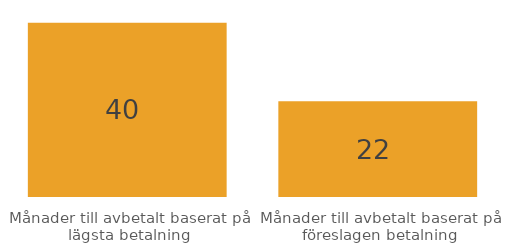
| Category | Series 0 |
|---|---|
| Månader till avbetalt baserat på lägsta betalning | 40 |
| Månader till avbetalt baserat på föreslagen betalning | 22 |